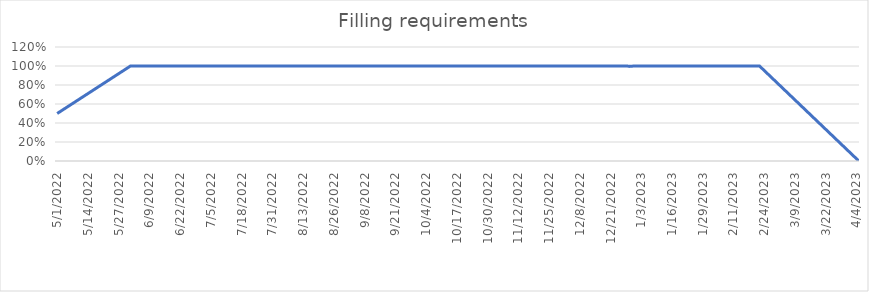
| Category | Series 0 |
|---|---|
| 01-05-2022 | 0.5 |
| 02-05-2022 | 0.516 |
| 03-05-2022 | 0.532 |
| 04-05-2022 | 0.548 |
| 05-05-2022 | 0.565 |
| 06-05-2022 | 0.581 |
| 07-05-2022 | 0.597 |
| 08-05-2022 | 0.613 |
| 09-05-2022 | 0.629 |
| 10-05-2022 | 0.645 |
| 11-05-2022 | 0.661 |
| 12-05-2022 | 0.677 |
| 13-05-2022 | 0.694 |
| 14-05-2022 | 0.71 |
| 15-05-2022 | 0.726 |
| 16-05-2022 | 0.742 |
| 17-05-2022 | 0.758 |
| 18-05-2022 | 0.774 |
| 19-05-2022 | 0.79 |
| 20-05-2022 | 0.806 |
| 21-05-2022 | 0.823 |
| 22-05-2022 | 0.839 |
| 23-05-2022 | 0.855 |
| 24-05-2022 | 0.871 |
| 25-05-2022 | 0.887 |
| 26-05-2022 | 0.903 |
| 27-05-2022 | 0.919 |
| 28-05-2022 | 0.935 |
| 29-05-2022 | 0.952 |
| 30-05-2022 | 0.968 |
| 31-05-2022 | 0.984 |
| 01-06-2022 | 1 |
| 02-06-2022 | 1 |
| 03-06-2022 | 1 |
| 04-06-2022 | 1 |
| 05-06-2022 | 1 |
| 06-06-2022 | 1 |
| 07-06-2022 | 1 |
| 08-06-2022 | 1 |
| 09-06-2022 | 1 |
| 10-06-2022 | 1 |
| 11-06-2022 | 1 |
| 12-06-2022 | 1 |
| 13-06-2022 | 1 |
| 14-06-2022 | 1 |
| 15-06-2022 | 1 |
| 16-06-2022 | 1 |
| 17-06-2022 | 1 |
| 18-06-2022 | 1 |
| 19-06-2022 | 1 |
| 20-06-2022 | 1 |
| 21-06-2022 | 1 |
| 22-06-2022 | 1 |
| 23-06-2022 | 1 |
| 24-06-2022 | 1 |
| 25-06-2022 | 1 |
| 26-06-2022 | 1 |
| 27-06-2022 | 1 |
| 28-06-2022 | 1 |
| 29-06-2022 | 1 |
| 30-06-2022 | 1 |
| 01-07-2022 | 1 |
| 02-07-2022 | 1 |
| 03-07-2022 | 1 |
| 04-07-2022 | 1 |
| 05-07-2022 | 1 |
| 06-07-2022 | 1 |
| 07-07-2022 | 1 |
| 08-07-2022 | 1 |
| 09-07-2022 | 1 |
| 10-07-2022 | 1 |
| 11-07-2022 | 1 |
| 12-07-2022 | 1 |
| 13-07-2022 | 1 |
| 14-07-2022 | 1 |
| 15-07-2022 | 1 |
| 16-07-2022 | 1 |
| 17-07-2022 | 1 |
| 18-07-2022 | 1 |
| 19-07-2022 | 1 |
| 20-07-2022 | 1 |
| 21-07-2022 | 1 |
| 22-07-2022 | 1 |
| 23-07-2022 | 1 |
| 24-07-2022 | 1 |
| 25-07-2022 | 1 |
| 26-07-2022 | 1 |
| 27-07-2022 | 1 |
| 28-07-2022 | 1 |
| 29-07-2022 | 1 |
| 30-07-2022 | 1 |
| 31-07-2022 | 1 |
| 01-08-2022 | 1 |
| 02-08-2022 | 1 |
| 03-08-2022 | 1 |
| 04-08-2022 | 1 |
| 05-08-2022 | 1 |
| 06-08-2022 | 1 |
| 07-08-2022 | 1 |
| 08-08-2022 | 1 |
| 09-08-2022 | 1 |
| 10-08-2022 | 1 |
| 11-08-2022 | 1 |
| 12-08-2022 | 1 |
| 13-08-2022 | 1 |
| 14-08-2022 | 1 |
| 15-08-2022 | 1 |
| 16-08-2022 | 1 |
| 17-08-2022 | 1 |
| 18-08-2022 | 1 |
| 19-08-2022 | 1 |
| 20-08-2022 | 1 |
| 21-08-2022 | 1 |
| 22-08-2022 | 1 |
| 23-08-2022 | 1 |
| 24-08-2022 | 1 |
| 25-08-2022 | 1 |
| 26-08-2022 | 1 |
| 27-08-2022 | 1 |
| 28-08-2022 | 1 |
| 29-08-2022 | 1 |
| 30-08-2022 | 1 |
| 31-08-2022 | 1 |
| 01-09-2022 | 1 |
| 02-09-2022 | 1 |
| 03-09-2022 | 1 |
| 04-09-2022 | 1 |
| 05-09-2022 | 1 |
| 06-09-2022 | 1 |
| 07-09-2022 | 1 |
| 08-09-2022 | 1 |
| 09-09-2022 | 1 |
| 10-09-2022 | 1 |
| 11-09-2022 | 1 |
| 12-09-2022 | 1 |
| 13-09-2022 | 1 |
| 14-09-2022 | 1 |
| 15-09-2022 | 1 |
| 16-09-2022 | 1 |
| 17-09-2022 | 1 |
| 18-09-2022 | 1 |
| 19-09-2022 | 1 |
| 20-09-2022 | 1 |
| 21-09-2022 | 1 |
| 22-09-2022 | 1 |
| 23-09-2022 | 1 |
| 24-09-2022 | 1 |
| 25-09-2022 | 1 |
| 26-09-2022 | 1 |
| 27-09-2022 | 1 |
| 28-09-2022 | 1 |
| 29-09-2022 | 1 |
| 30-09-2022 | 1 |
| 01-10-2022 | 1 |
| 02-10-2022 | 1 |
| 03-10-2022 | 1 |
| 04-10-2022 | 1 |
| 05-10-2022 | 1 |
| 06-10-2022 | 1 |
| 07-10-2022 | 1 |
| 08-10-2022 | 1 |
| 09-10-2022 | 1 |
| 10-10-2022 | 1 |
| 11-10-2022 | 1 |
| 12-10-2022 | 1 |
| 13-10-2022 | 1 |
| 14-10-2022 | 1 |
| 15-10-2022 | 1 |
| 16-10-2022 | 1 |
| 17-10-2022 | 1 |
| 18-10-2022 | 1 |
| 19-10-2022 | 1 |
| 20-10-2022 | 1 |
| 21-10-2022 | 1 |
| 22-10-2022 | 1 |
| 23-10-2022 | 1 |
| 24-10-2022 | 1 |
| 25-10-2022 | 1 |
| 26-10-2022 | 1 |
| 27-10-2022 | 1 |
| 28-10-2022 | 1 |
| 29-10-2022 | 1 |
| 30-10-2022 | 1 |
| 31-10-2022 | 1 |
| 01-11-2022 | 1 |
| 02-11-2022 | 1 |
| 03-11-2022 | 1 |
| 04-11-2022 | 1 |
| 05-11-2022 | 1 |
| 06-11-2022 | 1 |
| 07-11-2022 | 1 |
| 08-11-2022 | 1 |
| 09-11-2022 | 1 |
| 10-11-2022 | 1 |
| 11-11-2022 | 1 |
| 12-11-2022 | 1 |
| 13-11-2022 | 1 |
| 14-11-2022 | 1 |
| 15-11-2022 | 1 |
| 16-11-2022 | 1 |
| 17-11-2022 | 1 |
| 18-11-2022 | 1 |
| 19-11-2022 | 1 |
| 20-11-2022 | 1 |
| 21-11-2022 | 1 |
| 22-11-2022 | 1 |
| 23-11-2022 | 1 |
| 24-11-2022 | 1 |
| 25-11-2022 | 1 |
| 26-11-2022 | 1 |
| 27-11-2022 | 1 |
| 28-11-2022 | 1 |
| 29-11-2022 | 1 |
| 30-11-2022 | 1 |
| 01-12-2022 | 1 |
| 02-12-2022 | 1 |
| 03-12-2022 | 1 |
| 04-12-2022 | 1 |
| 05-12-2022 | 1 |
| 06-12-2022 | 1 |
| 07-12-2022 | 1 |
| 08-12-2022 | 1 |
| 09-12-2022 | 1 |
| 10-12-2022 | 1 |
| 11-12-2022 | 1 |
| 12-12-2022 | 1 |
| 13-12-2022 | 1 |
| 14-12-2022 | 1 |
| 15-12-2022 | 1 |
| 16-12-2022 | 1 |
| 17-12-2022 | 1 |
| 18-12-2022 | 1 |
| 19-12-2022 | 1 |
| 20-12-2022 | 1 |
| 21-12-2022 | 1 |
| 22-12-2022 | 1 |
| 23-12-2022 | 1 |
| 24-12-2022 | 1 |
| 25-12-2022 | 1 |
| 26-12-2022 | 1 |
| 27-12-2022 | 1 |
| 28-12-2022 | 1 |
| 29-12-2022 | 0.996 |
| 30-12-2022 | 0.998 |
| 31-12-2022 | 1 |
| 01-01-2023 | 1 |
| 02-01-2023 | 1 |
| 03-01-2023 | 1 |
| 04-01-2023 | 1 |
| 05-01-2023 | 1 |
| 06-01-2023 | 1 |
| 07-01-2023 | 1 |
| 08-01-2023 | 1 |
| 09-01-2023 | 1 |
| 10-01-2023 | 1 |
| 11-01-2023 | 1 |
| 12-01-2023 | 1 |
| 13-01-2023 | 1 |
| 14-01-2023 | 1 |
| 15-01-2023 | 1 |
| 16-01-2023 | 1 |
| 17-01-2023 | 1 |
| 18-01-2023 | 1 |
| 19-01-2023 | 1 |
| 20-01-2023 | 1 |
| 21-01-2023 | 1 |
| 22-01-2023 | 1 |
| 23-01-2023 | 1 |
| 24-01-2023 | 1 |
| 25-01-2023 | 1 |
| 26-01-2023 | 1 |
| 27-01-2023 | 1 |
| 28-01-2023 | 1 |
| 29-01-2023 | 1 |
| 30-01-2023 | 1 |
| 31-01-2023 | 1 |
| 01-02-2023 | 1 |
| 02-02-2023 | 1 |
| 03-02-2023 | 1 |
| 04-02-2023 | 1 |
| 05-02-2023 | 1 |
| 06-02-2023 | 1 |
| 07-02-2023 | 1 |
| 08-02-2023 | 1 |
| 09-02-2023 | 1 |
| 10-02-2023 | 1 |
| 11-02-2023 | 1 |
| 12-02-2023 | 1 |
| 13-02-2023 | 1 |
| 14-02-2023 | 1 |
| 15-02-2023 | 1 |
| 16-02-2023 | 1 |
| 17-02-2023 | 1 |
| 18-02-2023 | 1 |
| 19-02-2023 | 1 |
| 20-02-2023 | 1 |
| 21-02-2023 | 1 |
| 22-02-2023 | 1 |
| 23-02-2023 | 0.976 |
| 24-02-2023 | 0.952 |
| 25-02-2023 | 0.929 |
| 26-02-2023 | 0.905 |
| 27-02-2023 | 0.881 |
| 28-02-2023 | 0.857 |
| 01-03-2023 | 0.833 |
| 02-03-2023 | 0.81 |
| 03-03-2023 | 0.786 |
| 04-03-2023 | 0.762 |
| 05-03-2023 | 0.738 |
| 06-03-2023 | 0.714 |
| 07-03-2023 | 0.69 |
| 08-03-2023 | 0.667 |
| 09-03-2023 | 0.643 |
| 10-03-2023 | 0.619 |
| 11-03-2023 | 0.595 |
| 12-03-2023 | 0.571 |
| 13-03-2023 | 0.548 |
| 14-03-2023 | 0.524 |
| 15-03-2023 | 0.5 |
| 16-03-2023 | 0.476 |
| 17-03-2023 | 0.452 |
| 18-03-2023 | 0.429 |
| 19-03-2023 | 0.405 |
| 20-03-2023 | 0.381 |
| 21-03-2023 | 0.357 |
| 22-03-2023 | 0.333 |
| 23-03-2023 | 0.31 |
| 24-03-2023 | 0.286 |
| 25-03-2023 | 0.262 |
| 26-03-2023 | 0.238 |
| 27-03-2023 | 0.214 |
| 28-03-2023 | 0.19 |
| 29-03-2023 | 0.167 |
| 30-03-2023 | 0.143 |
| 31-03-2023 | 0.119 |
| 01-04-2023 | 0.095 |
| 02-04-2023 | 0.071 |
| 03-04-2023 | 0.048 |
| 04-04-2023 | 0.024 |
| Fra 05-04-2023 til 30-04-2023 | 0 |